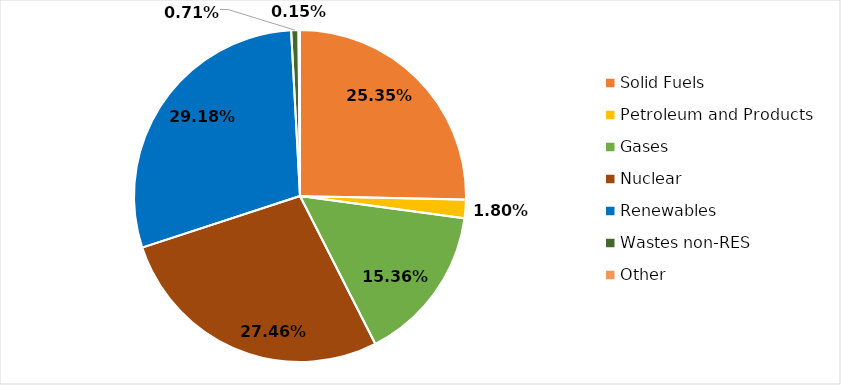
| Category | Series 0 |
|---|---|
| Solid Fuels | 0.253 |
| Petroleum and Products | 0.018 |
| Gases | 0.154 |
| Nuclear | 0.275 |
| Renewables | 0.292 |
| Wastes non-RES | 0.007 |
| Other | 0.001 |